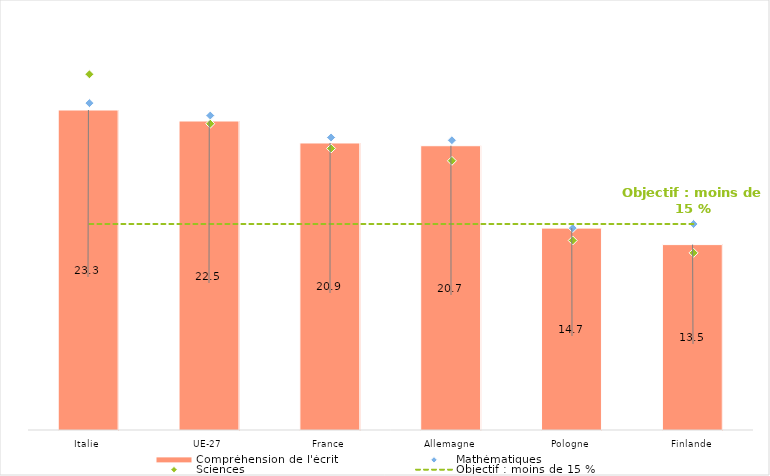
| Category | Compréhension de l'écrit |
|---|---|
| Italie | 23.3 |
| UE-27 | 22.5 |
| France | 20.9 |
| Allemagne | 20.7 |
| Pologne | 14.7 |
| Finlande | 13.5 |